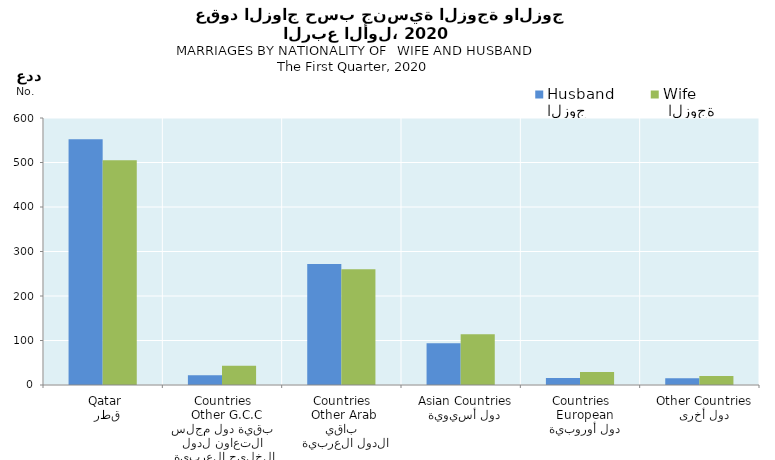
| Category | الزوج
Husband |  الزوجة
Wife |
|---|---|---|
|   قطر
 Qatar | 552 | 505 |
|  بقية دول مجلس التعاون لدول الخليج العربية
  Other G.C.C Countries | 22 | 43 |
|   باقي الدول العربية
 Other Arab Countries | 272 | 260 |
|   دول أسيوية
  Asian Countries | 94 | 114 |
|   دول أوروبية
  European Countries | 16 | 29 |
|   دول أخرى
  Other Countries | 15 | 20 |